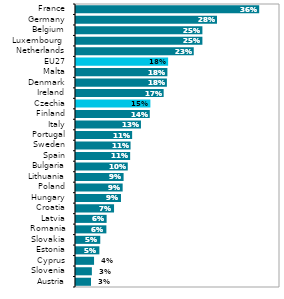
| Category | Series 1 |
|---|---|
| Austria | 0.029 |
| Slovenia | 0.031 |
| Cyprus | 0.035 |
| Estonia | 0.046 |
| Slovakia | 0.048 |
| Romania | 0.06 |
| Latvia | 0.06 |
| Croatia | 0.075 |
| Hungary | 0.088 |
| Poland | 0.091 |
| Lithuania | 0.093 |
| Bulgaria | 0.102 |
| Spain | 0.106 |
| Sweden | 0.107 |
| Portugal | 0.11 |
| Italy | 0.127 |
| Finland | 0.145 |
| Czechia | 0.146 |
| Ireland | 0.172 |
| Denmark | 0.178 |
| Malta | 0.179 |
| EU27 | 0.181 |
| Netherlands | 0.231 |
| Luxembourg  | 0.248 |
| Belgium | 0.248 |
| Germany | 0.276 |
| France | 0.359 |